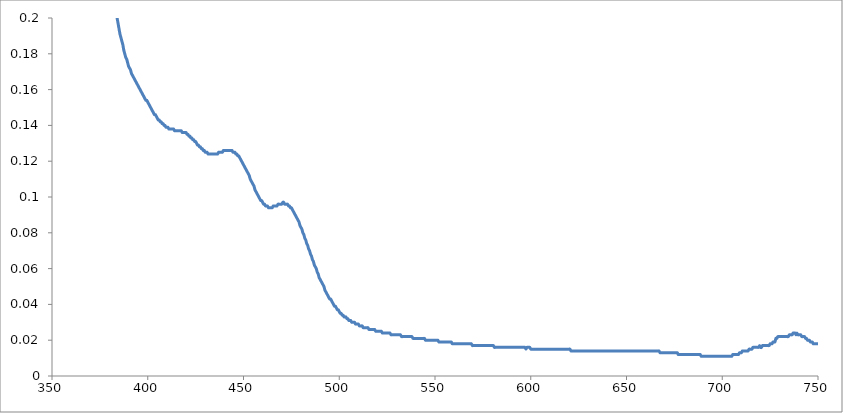
| Category | Series 0 |
|---|---|
| 350.0 | 0.917 |
| 350.5 | 0.901 |
| 351.0 | 0.881 |
| 351.5 | 0.863 |
| 352.0 | 0.845 |
| 352.5 | 0.826 |
| 353.0 | 0.807 |
| 353.5 | 0.789 |
| 354.0 | 0.771 |
| 354.5 | 0.753 |
| 355.0 | 0.735 |
| 355.5 | 0.717 |
| 356.0 | 0.699 |
| 356.5 | 0.682 |
| 357.0 | 0.666 |
| 357.5 | 0.649 |
| 358.0 | 0.633 |
| 358.5 | 0.617 |
| 359.0 | 0.601 |
| 359.5 | 0.586 |
| 360.0 | 0.571 |
| 360.5 | 0.556 |
| 361.0 | 0.541 |
| 361.5 | 0.527 |
| 362.0 | 0.514 |
| 362.5 | 0.5 |
| 363.0 | 0.488 |
| 363.5 | 0.475 |
| 364.0 | 0.463 |
| 364.5 | 0.452 |
| 365.0 | 0.438 |
| 365.5 | 0.427 |
| 366.0 | 0.415 |
| 366.5 | 0.405 |
| 367.0 | 0.395 |
| 367.5 | 0.386 |
| 368.0 | 0.377 |
| 368.5 | 0.367 |
| 369.0 | 0.358 |
| 369.5 | 0.35 |
| 370.0 | 0.341 |
| 370.5 | 0.334 |
| 371.0 | 0.326 |
| 371.5 | 0.319 |
| 372.0 | 0.311 |
| 372.5 | 0.305 |
| 373.0 | 0.298 |
| 373.5 | 0.292 |
| 374.0 | 0.286 |
| 374.5 | 0.28 |
| 375.0 | 0.274 |
| 375.5 | 0.269 |
| 376.0 | 0.263 |
| 376.5 | 0.258 |
| 377.0 | 0.254 |
| 377.5 | 0.249 |
| 378.0 | 0.244 |
| 378.5 | 0.239 |
| 379.0 | 0.235 |
| 379.5 | 0.231 |
| 380.0 | 0.227 |
| 380.5 | 0.223 |
| 381.0 | 0.219 |
| 381.5 | 0.216 |
| 382.0 | 0.212 |
| 382.5 | 0.209 |
| 383.0 | 0.206 |
| 383.5 | 0.203 |
| 384.0 | 0.2 |
| 384.5 | 0.197 |
| 385.0 | 0.194 |
| 385.5 | 0.191 |
| 386.0 | 0.189 |
| 386.5 | 0.187 |
| 387.0 | 0.185 |
| 387.5 | 0.182 |
| 388.0 | 0.18 |
| 388.5 | 0.178 |
| 389.0 | 0.177 |
| 389.5 | 0.175 |
| 390.0 | 0.173 |
| 390.5 | 0.172 |
| 391.0 | 0.171 |
| 391.5 | 0.169 |
| 392.0 | 0.168 |
| 392.5 | 0.167 |
| 393.0 | 0.166 |
| 393.5 | 0.165 |
| 394.0 | 0.164 |
| 394.5 | 0.163 |
| 395.0 | 0.162 |
| 395.5 | 0.161 |
| 396.0 | 0.16 |
| 396.5 | 0.159 |
| 397.0 | 0.158 |
| 397.5 | 0.157 |
| 398.0 | 0.156 |
| 398.5 | 0.155 |
| 399.0 | 0.154 |
| 399.5 | 0.154 |
| 400.0 | 0.153 |
| 400.5 | 0.152 |
| 401.0 | 0.151 |
| 401.5 | 0.15 |
| 402.0 | 0.149 |
| 402.5 | 0.148 |
| 403.0 | 0.147 |
| 403.5 | 0.146 |
| 404.0 | 0.146 |
| 404.5 | 0.145 |
| 405.0 | 0.144 |
| 405.5 | 0.143 |
| 406.0 | 0.143 |
| 406.5 | 0.142 |
| 407.0 | 0.142 |
| 407.5 | 0.141 |
| 408.0 | 0.141 |
| 408.5 | 0.14 |
| 409.0 | 0.14 |
| 409.5 | 0.139 |
| 410.0 | 0.139 |
| 410.5 | 0.139 |
| 411.0 | 0.138 |
| 411.5 | 0.138 |
| 412.0 | 0.138 |
| 412.5 | 0.138 |
| 413.0 | 0.138 |
| 413.5 | 0.138 |
| 414.0 | 0.137 |
| 414.5 | 0.137 |
| 415.0 | 0.137 |
| 415.5 | 0.137 |
| 416.0 | 0.137 |
| 416.5 | 0.137 |
| 417.0 | 0.137 |
| 417.5 | 0.137 |
| 418.0 | 0.136 |
| 418.5 | 0.136 |
| 419.0 | 0.136 |
| 419.5 | 0.136 |
| 420.0 | 0.136 |
| 420.5 | 0.135 |
| 421.0 | 0.135 |
| 421.5 | 0.134 |
| 422.0 | 0.134 |
| 422.5 | 0.133 |
| 423.0 | 0.133 |
| 423.5 | 0.132 |
| 424.0 | 0.132 |
| 424.5 | 0.131 |
| 425.0 | 0.131 |
| 425.5 | 0.13 |
| 426.0 | 0.129 |
| 426.5 | 0.129 |
| 427.0 | 0.128 |
| 427.5 | 0.128 |
| 428.0 | 0.127 |
| 428.5 | 0.127 |
| 429.0 | 0.126 |
| 429.5 | 0.126 |
| 430.0 | 0.125 |
| 430.5 | 0.125 |
| 431.0 | 0.125 |
| 431.5 | 0.124 |
| 432.0 | 0.124 |
| 432.5 | 0.124 |
| 433.0 | 0.124 |
| 433.5 | 0.124 |
| 434.0 | 0.124 |
| 434.5 | 0.124 |
| 435.0 | 0.124 |
| 435.5 | 0.124 |
| 436.0 | 0.124 |
| 436.5 | 0.124 |
| 437.0 | 0.125 |
| 437.5 | 0.125 |
| 438.0 | 0.125 |
| 438.5 | 0.125 |
| 439.0 | 0.125 |
| 439.5 | 0.126 |
| 440.0 | 0.126 |
| 440.5 | 0.126 |
| 441.0 | 0.126 |
| 441.5 | 0.126 |
| 442.0 | 0.126 |
| 442.5 | 0.126 |
| 443.0 | 0.126 |
| 443.5 | 0.126 |
| 444.0 | 0.126 |
| 444.5 | 0.125 |
| 445.0 | 0.125 |
| 445.5 | 0.125 |
| 446.0 | 0.124 |
| 446.5 | 0.124 |
| 447.0 | 0.123 |
| 447.5 | 0.123 |
| 448.0 | 0.122 |
| 448.5 | 0.121 |
| 449.0 | 0.12 |
| 449.5 | 0.119 |
| 450.0 | 0.118 |
| 450.5 | 0.117 |
| 451.0 | 0.116 |
| 451.5 | 0.115 |
| 452.0 | 0.114 |
| 452.5 | 0.113 |
| 453.0 | 0.112 |
| 453.5 | 0.11 |
| 454.0 | 0.109 |
| 454.5 | 0.108 |
| 455.0 | 0.107 |
| 455.5 | 0.106 |
| 456.0 | 0.104 |
| 456.5 | 0.103 |
| 457.0 | 0.102 |
| 457.5 | 0.101 |
| 458.0 | 0.1 |
| 458.5 | 0.099 |
| 459.0 | 0.098 |
| 459.5 | 0.098 |
| 460.0 | 0.097 |
| 460.5 | 0.096 |
| 461.0 | 0.096 |
| 461.5 | 0.095 |
| 462.0 | 0.095 |
| 462.5 | 0.095 |
| 463.0 | 0.094 |
| 463.5 | 0.094 |
| 464.0 | 0.094 |
| 464.5 | 0.094 |
| 465.0 | 0.094 |
| 465.5 | 0.095 |
| 466.0 | 0.095 |
| 466.5 | 0.095 |
| 467.0 | 0.095 |
| 467.5 | 0.095 |
| 468.0 | 0.096 |
| 468.5 | 0.096 |
| 469.0 | 0.096 |
| 469.5 | 0.096 |
| 470.0 | 0.096 |
| 470.5 | 0.097 |
| 471.0 | 0.097 |
| 471.5 | 0.096 |
| 472.0 | 0.096 |
| 472.5 | 0.096 |
| 473.0 | 0.096 |
| 473.5 | 0.095 |
| 474.0 | 0.095 |
| 474.5 | 0.094 |
| 475.0 | 0.094 |
| 475.5 | 0.093 |
| 476.0 | 0.092 |
| 476.5 | 0.091 |
| 477.0 | 0.09 |
| 477.5 | 0.089 |
| 478.0 | 0.088 |
| 478.5 | 0.087 |
| 479.0 | 0.086 |
| 479.5 | 0.084 |
| 480.0 | 0.083 |
| 480.5 | 0.082 |
| 481.0 | 0.08 |
| 481.5 | 0.079 |
| 482.0 | 0.077 |
| 482.5 | 0.076 |
| 483.0 | 0.074 |
| 483.5 | 0.073 |
| 484.0 | 0.071 |
| 484.5 | 0.07 |
| 485.0 | 0.068 |
| 485.5 | 0.067 |
| 486.0 | 0.065 |
| 486.5 | 0.064 |
| 487.0 | 0.062 |
| 487.5 | 0.061 |
| 488.0 | 0.06 |
| 488.5 | 0.058 |
| 489.0 | 0.057 |
| 489.5 | 0.055 |
| 490.0 | 0.054 |
| 490.5 | 0.053 |
| 491.0 | 0.052 |
| 491.5 | 0.051 |
| 492.0 | 0.05 |
| 492.5 | 0.048 |
| 493.0 | 0.047 |
| 493.5 | 0.046 |
| 494.0 | 0.045 |
| 494.5 | 0.044 |
| 495.0 | 0.043 |
| 495.5 | 0.043 |
| 496.0 | 0.042 |
| 496.5 | 0.041 |
| 497.0 | 0.04 |
| 497.5 | 0.039 |
| 498.0 | 0.039 |
| 498.5 | 0.038 |
| 499.0 | 0.037 |
| 499.5 | 0.037 |
| 500.0 | 0.036 |
| 500.5 | 0.035 |
| 501.0 | 0.035 |
| 501.5 | 0.034 |
| 502.0 | 0.034 |
| 502.5 | 0.033 |
| 503.0 | 0.033 |
| 503.5 | 0.033 |
| 504.0 | 0.032 |
| 504.5 | 0.032 |
| 505.0 | 0.031 |
| 505.5 | 0.031 |
| 506.0 | 0.031 |
| 506.5 | 0.03 |
| 507.0 | 0.03 |
| 507.5 | 0.03 |
| 508.0 | 0.03 |
| 508.5 | 0.029 |
| 509.0 | 0.029 |
| 509.5 | 0.029 |
| 510.0 | 0.029 |
| 510.5 | 0.028 |
| 511.0 | 0.028 |
| 511.5 | 0.028 |
| 512.0 | 0.028 |
| 512.5 | 0.027 |
| 513.0 | 0.027 |
| 513.5 | 0.027 |
| 514.0 | 0.027 |
| 514.5 | 0.027 |
| 515.0 | 0.027 |
| 515.5 | 0.026 |
| 516.0 | 0.026 |
| 516.5 | 0.026 |
| 517.0 | 0.026 |
| 517.5 | 0.026 |
| 518.0 | 0.026 |
| 518.5 | 0.026 |
| 519.0 | 0.025 |
| 519.5 | 0.025 |
| 520.0 | 0.025 |
| 520.5 | 0.025 |
| 521.0 | 0.025 |
| 521.5 | 0.025 |
| 522.0 | 0.025 |
| 522.5 | 0.024 |
| 523.0 | 0.024 |
| 523.5 | 0.024 |
| 524.0 | 0.024 |
| 524.5 | 0.024 |
| 525.0 | 0.024 |
| 525.5 | 0.024 |
| 526.0 | 0.024 |
| 526.5 | 0.024 |
| 527.0 | 0.023 |
| 527.5 | 0.023 |
| 528.0 | 0.023 |
| 528.5 | 0.023 |
| 529.0 | 0.023 |
| 529.5 | 0.023 |
| 530.0 | 0.023 |
| 530.5 | 0.023 |
| 531.0 | 0.023 |
| 531.5 | 0.023 |
| 532.0 | 0.023 |
| 532.5 | 0.022 |
| 533.0 | 0.022 |
| 533.5 | 0.022 |
| 534.0 | 0.022 |
| 534.5 | 0.022 |
| 535.0 | 0.022 |
| 535.5 | 0.022 |
| 536.0 | 0.022 |
| 536.5 | 0.022 |
| 537.0 | 0.022 |
| 537.5 | 0.022 |
| 538.0 | 0.022 |
| 538.5 | 0.021 |
| 539.0 | 0.021 |
| 539.5 | 0.021 |
| 540.0 | 0.021 |
| 540.5 | 0.021 |
| 541.0 | 0.021 |
| 541.5 | 0.021 |
| 542.0 | 0.021 |
| 542.5 | 0.021 |
| 543.0 | 0.021 |
| 543.5 | 0.021 |
| 544.0 | 0.021 |
| 544.5 | 0.021 |
| 545.0 | 0.02 |
| 545.5 | 0.02 |
| 546.0 | 0.02 |
| 546.5 | 0.02 |
| 547.0 | 0.02 |
| 547.5 | 0.02 |
| 548.0 | 0.02 |
| 548.5 | 0.02 |
| 549.0 | 0.02 |
| 549.5 | 0.02 |
| 550.0 | 0.02 |
| 550.5 | 0.02 |
| 551.0 | 0.02 |
| 551.5 | 0.02 |
| 552.0 | 0.019 |
| 552.5 | 0.019 |
| 553.0 | 0.019 |
| 553.5 | 0.019 |
| 554.0 | 0.019 |
| 554.5 | 0.019 |
| 555.0 | 0.019 |
| 555.5 | 0.019 |
| 556.0 | 0.019 |
| 556.5 | 0.019 |
| 557.0 | 0.019 |
| 557.5 | 0.019 |
| 558.0 | 0.019 |
| 558.5 | 0.019 |
| 559.0 | 0.018 |
| 559.5 | 0.018 |
| 560.0 | 0.018 |
| 560.5 | 0.018 |
| 561.0 | 0.018 |
| 561.5 | 0.018 |
| 562.0 | 0.018 |
| 562.5 | 0.018 |
| 563.0 | 0.018 |
| 563.5 | 0.018 |
| 564.0 | 0.018 |
| 564.5 | 0.018 |
| 565.0 | 0.018 |
| 565.5 | 0.018 |
| 566.0 | 0.018 |
| 566.5 | 0.018 |
| 567.0 | 0.018 |
| 567.5 | 0.018 |
| 568.0 | 0.018 |
| 568.5 | 0.018 |
| 569.0 | 0.018 |
| 569.5 | 0.017 |
| 570.0 | 0.017 |
| 570.5 | 0.017 |
| 571.0 | 0.017 |
| 571.5 | 0.017 |
| 572.0 | 0.017 |
| 572.5 | 0.017 |
| 573.0 | 0.017 |
| 573.5 | 0.017 |
| 574.0 | 0.017 |
| 574.5 | 0.017 |
| 575.0 | 0.017 |
| 575.5 | 0.017 |
| 576.0 | 0.017 |
| 576.5 | 0.017 |
| 577.0 | 0.017 |
| 577.5 | 0.017 |
| 578.0 | 0.017 |
| 578.5 | 0.017 |
| 579.0 | 0.017 |
| 579.5 | 0.017 |
| 580.0 | 0.017 |
| 580.5 | 0.017 |
| 581.0 | 0.016 |
| 581.5 | 0.016 |
| 582.0 | 0.016 |
| 582.5 | 0.016 |
| 583.0 | 0.016 |
| 583.5 | 0.016 |
| 584.0 | 0.016 |
| 584.5 | 0.016 |
| 585.0 | 0.016 |
| 585.5 | 0.016 |
| 586.0 | 0.016 |
| 586.5 | 0.016 |
| 587.0 | 0.016 |
| 587.5 | 0.016 |
| 588.0 | 0.016 |
| 588.5 | 0.016 |
| 589.0 | 0.016 |
| 589.5 | 0.016 |
| 590.0 | 0.016 |
| 590.5 | 0.016 |
| 591.0 | 0.016 |
| 591.5 | 0.016 |
| 592.0 | 0.016 |
| 592.5 | 0.016 |
| 593.0 | 0.016 |
| 593.5 | 0.016 |
| 594.0 | 0.016 |
| 594.5 | 0.016 |
| 595.0 | 0.016 |
| 595.5 | 0.016 |
| 596.0 | 0.016 |
| 596.5 | 0.016 |
| 597.0 | 0.016 |
| 597.5 | 0.015 |
| 598.0 | 0.016 |
| 598.5 | 0.016 |
| 599.0 | 0.016 |
| 599.5 | 0.016 |
| 600.0 | 0.015 |
| 600.5 | 0.015 |
| 601.0 | 0.015 |
| 601.5 | 0.015 |
| 602.0 | 0.015 |
| 602.5 | 0.015 |
| 603.0 | 0.015 |
| 603.5 | 0.015 |
| 604.0 | 0.015 |
| 604.5 | 0.015 |
| 605.0 | 0.015 |
| 605.5 | 0.015 |
| 606.0 | 0.015 |
| 606.5 | 0.015 |
| 607.0 | 0.015 |
| 607.5 | 0.015 |
| 608.0 | 0.015 |
| 608.5 | 0.015 |
| 609.0 | 0.015 |
| 609.5 | 0.015 |
| 610.0 | 0.015 |
| 610.5 | 0.015 |
| 611.0 | 0.015 |
| 611.5 | 0.015 |
| 612.0 | 0.015 |
| 612.5 | 0.015 |
| 613.0 | 0.015 |
| 613.5 | 0.015 |
| 614.0 | 0.015 |
| 614.5 | 0.015 |
| 615.0 | 0.015 |
| 615.5 | 0.015 |
| 616.0 | 0.015 |
| 616.5 | 0.015 |
| 617.0 | 0.015 |
| 617.5 | 0.015 |
| 618.0 | 0.015 |
| 618.5 | 0.015 |
| 619.0 | 0.015 |
| 619.5 | 0.015 |
| 620.0 | 0.015 |
| 620.5 | 0.015 |
| 621.0 | 0.014 |
| 621.5 | 0.014 |
| 622.0 | 0.014 |
| 622.5 | 0.014 |
| 623.0 | 0.014 |
| 623.5 | 0.014 |
| 624.0 | 0.014 |
| 624.5 | 0.014 |
| 625.0 | 0.014 |
| 625.5 | 0.014 |
| 626.0 | 0.014 |
| 626.5 | 0.014 |
| 627.0 | 0.014 |
| 627.5 | 0.014 |
| 628.0 | 0.014 |
| 628.5 | 0.014 |
| 629.0 | 0.014 |
| 629.5 | 0.014 |
| 630.0 | 0.014 |
| 630.5 | 0.014 |
| 631.0 | 0.014 |
| 631.5 | 0.014 |
| 632.0 | 0.014 |
| 632.5 | 0.014 |
| 633.0 | 0.014 |
| 633.5 | 0.014 |
| 634.0 | 0.014 |
| 634.5 | 0.014 |
| 635.0 | 0.014 |
| 635.5 | 0.014 |
| 636.0 | 0.014 |
| 636.5 | 0.014 |
| 637.0 | 0.014 |
| 637.5 | 0.014 |
| 638.0 | 0.014 |
| 638.5 | 0.014 |
| 639.0 | 0.014 |
| 639.5 | 0.014 |
| 640.0 | 0.014 |
| 640.5 | 0.014 |
| 641.0 | 0.014 |
| 641.5 | 0.014 |
| 642.0 | 0.014 |
| 642.5 | 0.014 |
| 643.0 | 0.014 |
| 643.5 | 0.014 |
| 644.0 | 0.014 |
| 644.5 | 0.014 |
| 645.0 | 0.014 |
| 645.5 | 0.014 |
| 646.0 | 0.014 |
| 646.5 | 0.014 |
| 647.0 | 0.014 |
| 647.5 | 0.014 |
| 648.0 | 0.014 |
| 648.5 | 0.014 |
| 649.0 | 0.014 |
| 649.5 | 0.014 |
| 650.0 | 0.014 |
| 650.5 | 0.014 |
| 651.0 | 0.014 |
| 651.5 | 0.014 |
| 652.0 | 0.014 |
| 652.5 | 0.014 |
| 653.0 | 0.014 |
| 653.5 | 0.014 |
| 654.0 | 0.014 |
| 654.5 | 0.014 |
| 655.0 | 0.014 |
| 655.5 | 0.014 |
| 656.0 | 0.014 |
| 656.5 | 0.014 |
| 657.0 | 0.014 |
| 657.5 | 0.014 |
| 658.0 | 0.014 |
| 658.5 | 0.014 |
| 659.0 | 0.014 |
| 659.5 | 0.014 |
| 660.0 | 0.014 |
| 660.5 | 0.014 |
| 661.0 | 0.014 |
| 661.5 | 0.014 |
| 662.0 | 0.014 |
| 662.5 | 0.014 |
| 663.0 | 0.014 |
| 663.5 | 0.014 |
| 664.0 | 0.014 |
| 664.5 | 0.014 |
| 665.0 | 0.014 |
| 665.5 | 0.014 |
| 666.0 | 0.014 |
| 666.5 | 0.014 |
| 667.0 | 0.014 |
| 667.5 | 0.013 |
| 668.0 | 0.013 |
| 668.5 | 0.013 |
| 669.0 | 0.013 |
| 669.5 | 0.013 |
| 670.0 | 0.013 |
| 670.5 | 0.013 |
| 671.0 | 0.013 |
| 671.5 | 0.013 |
| 672.0 | 0.013 |
| 672.5 | 0.013 |
| 673.0 | 0.013 |
| 673.5 | 0.013 |
| 674.0 | 0.013 |
| 674.5 | 0.013 |
| 675.0 | 0.013 |
| 675.5 | 0.013 |
| 676.0 | 0.013 |
| 676.5 | 0.013 |
| 677.0 | 0.012 |
| 677.5 | 0.012 |
| 678.0 | 0.012 |
| 678.5 | 0.012 |
| 679.0 | 0.012 |
| 679.5 | 0.012 |
| 680.0 | 0.012 |
| 680.5 | 0.012 |
| 681.0 | 0.012 |
| 681.5 | 0.012 |
| 682.0 | 0.012 |
| 682.5 | 0.012 |
| 683.0 | 0.012 |
| 683.5 | 0.012 |
| 684.0 | 0.012 |
| 684.5 | 0.012 |
| 685.0 | 0.012 |
| 685.5 | 0.012 |
| 686.0 | 0.012 |
| 686.5 | 0.012 |
| 687.0 | 0.012 |
| 687.5 | 0.012 |
| 688.0 | 0.012 |
| 688.5 | 0.012 |
| 689.0 | 0.011 |
| 689.5 | 0.011 |
| 690.0 | 0.011 |
| 690.5 | 0.011 |
| 691.0 | 0.011 |
| 691.5 | 0.011 |
| 692.0 | 0.011 |
| 692.5 | 0.011 |
| 693.0 | 0.011 |
| 693.5 | 0.011 |
| 694.0 | 0.011 |
| 694.5 | 0.011 |
| 695.0 | 0.011 |
| 695.5 | 0.011 |
| 696.0 | 0.011 |
| 696.5 | 0.011 |
| 697.0 | 0.011 |
| 697.5 | 0.011 |
| 698.0 | 0.011 |
| 698.5 | 0.011 |
| 699.0 | 0.011 |
| 699.5 | 0.011 |
| 700.0 | 0.011 |
| 700.5 | 0.011 |
| 701.0 | 0.011 |
| 701.5 | 0.011 |
| 702.0 | 0.011 |
| 702.5 | 0.011 |
| 703.0 | 0.011 |
| 703.5 | 0.011 |
| 704.0 | 0.011 |
| 704.5 | 0.011 |
| 705.0 | 0.011 |
| 705.5 | 0.012 |
| 706.0 | 0.012 |
| 706.5 | 0.012 |
| 707.0 | 0.012 |
| 707.5 | 0.012 |
| 708.0 | 0.012 |
| 708.5 | 0.012 |
| 709.0 | 0.013 |
| 709.5 | 0.013 |
| 710.0 | 0.013 |
| 710.5 | 0.014 |
| 711.0 | 0.014 |
| 711.5 | 0.014 |
| 712.0 | 0.014 |
| 712.5 | 0.014 |
| 713.0 | 0.014 |
| 713.5 | 0.014 |
| 714.0 | 0.015 |
| 714.5 | 0.015 |
| 715.0 | 0.015 |
| 715.5 | 0.015 |
| 716.0 | 0.016 |
| 716.5 | 0.016 |
| 717.0 | 0.016 |
| 717.5 | 0.016 |
| 718.0 | 0.016 |
| 718.5 | 0.016 |
| 719.0 | 0.016 |
| 719.5 | 0.017 |
| 720.0 | 0.016 |
| 720.5 | 0.016 |
| 721.0 | 0.017 |
| 721.5 | 0.017 |
| 722.0 | 0.017 |
| 722.5 | 0.017 |
| 723.0 | 0.017 |
| 723.5 | 0.017 |
| 724.0 | 0.017 |
| 724.5 | 0.017 |
| 725.0 | 0.018 |
| 725.5 | 0.018 |
| 726.0 | 0.018 |
| 726.5 | 0.019 |
| 727.0 | 0.019 |
| 727.5 | 0.019 |
| 728.0 | 0.021 |
| 728.5 | 0.021 |
| 729.0 | 0.022 |
| 729.5 | 0.022 |
| 730.0 | 0.022 |
| 730.5 | 0.022 |
| 731.0 | 0.022 |
| 731.5 | 0.022 |
| 732.0 | 0.022 |
| 732.5 | 0.022 |
| 733.0 | 0.022 |
| 733.5 | 0.022 |
| 734.0 | 0.022 |
| 734.5 | 0.022 |
| 735.0 | 0.023 |
| 735.5 | 0.023 |
| 736.0 | 0.023 |
| 736.5 | 0.023 |
| 737.0 | 0.024 |
| 737.5 | 0.024 |
| 738.0 | 0.024 |
| 738.5 | 0.023 |
| 739.0 | 0.024 |
| 739.5 | 0.023 |
| 740.0 | 0.023 |
| 740.5 | 0.023 |
| 741.0 | 0.023 |
| 741.5 | 0.022 |
| 742.0 | 0.022 |
| 742.5 | 0.022 |
| 743.0 | 0.022 |
| 743.5 | 0.021 |
| 744.0 | 0.021 |
| 744.5 | 0.02 |
| 745.0 | 0.02 |
| 745.5 | 0.02 |
| 746.0 | 0.019 |
| 746.5 | 0.019 |
| 747.0 | 0.019 |
| 747.5 | 0.018 |
| 748.0 | 0.018 |
| 748.5 | 0.018 |
| 749.0 | 0.018 |
| 749.5 | 0.018 |
| 750.0 | 0.018 |